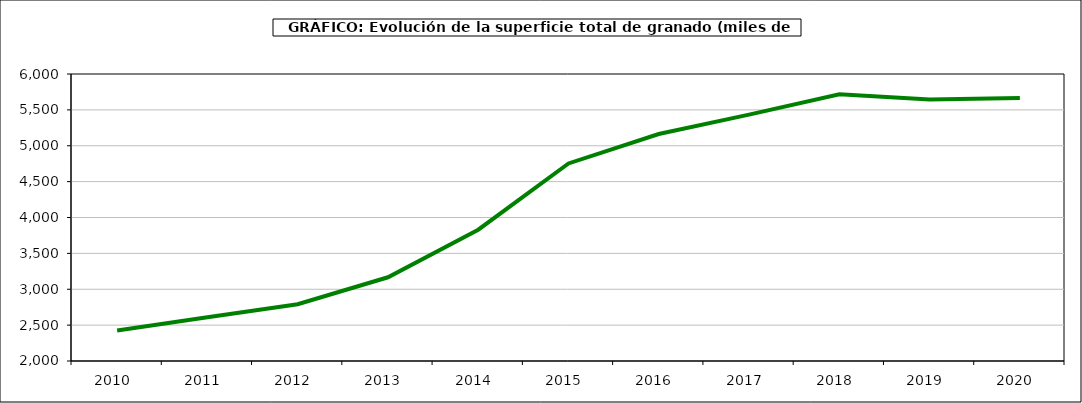
| Category | superficie granado |
|---|---|
| 2010.0 | 2425 |
| 2011.0 | 2610 |
| 2012.0 | 2791 |
| 2013.0 | 3167 |
| 2014.0 | 3830 |
| 2015.0 | 4753 |
| 2016.0 | 5163 |
| 2017.0 | 5434 |
| 2018.0 | 5716 |
| 2019.0 | 5645 |
| 2020.0 | 5666 |